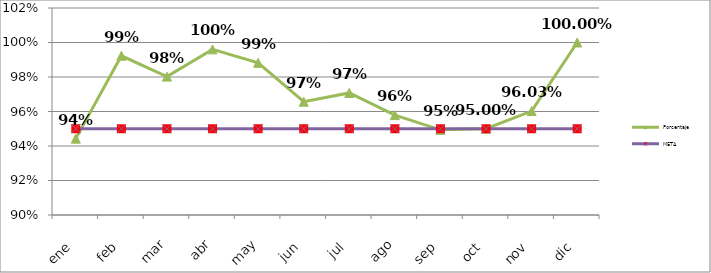
| Category | Porcentaje | META |
|---|---|---|
| ene | 0.944 | 0.95 |
| feb | 0.992 | 0.95 |
| mar | 0.98 | 0.95 |
| abr | 0.996 | 0.95 |
| may | 0.988 | 0.95 |
| jun | 0.966 | 0.95 |
| jul | 0.971 | 0.95 |
| ago | 0.958 | 0.95 |
| sep | 0.949 | 0.95 |
| oct | 0.95 | 0.95 |
| nov | 0.96 | 0.95 |
| dic | 1 | 0.95 |